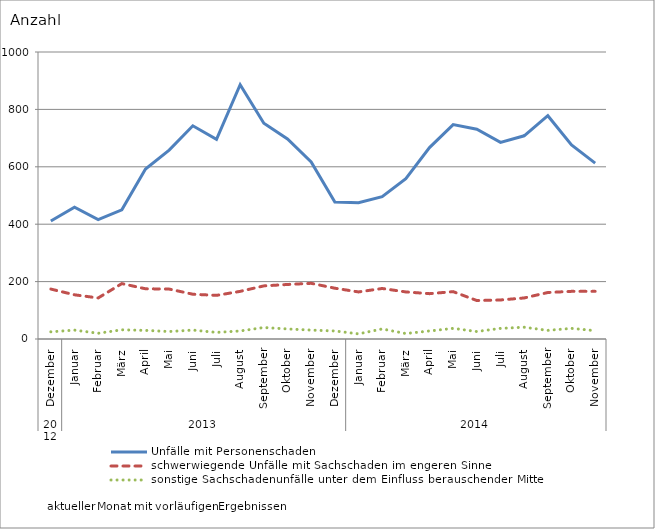
| Category | Unfälle mit Personenschaden | schwerwiegende Unfälle mit Sachschaden im engeren Sinne | sonstige Sachschadenunfälle unter dem Einfluss berauschender Mittel |
|---|---|---|---|
| 0 | 411 | 174 | 25 |
| 1 | 459 | 154 | 31 |
| 2 | 416 | 143 | 20 |
| 3 | 450 | 193 | 32 |
| 4 | 592 | 175 | 30 |
| 5 | 658 | 174 | 26 |
| 6 | 743 | 156 | 31 |
| 7 | 696 | 152 | 23 |
| 8 | 886 | 166 | 28 |
| 9 | 752 | 185 | 40 |
| 10 | 697 | 190 | 35 |
| 11 | 617 | 194 | 31 |
| 12 | 477 | 177 | 28 |
| 13 | 475 | 164 | 18 |
| 14 | 496 | 176 | 35 |
| 15 | 559 | 164 | 19 |
| 16 | 667 | 158 | 28 |
| 17 | 747 | 165 | 37 |
| 18 | 731 | 134 | 26 |
| 19 | 685 | 136 | 37 |
| 20 | 708 | 143 | 41 |
| 21 | 778 | 162 | 30 |
| 22 | 676 | 166 | 37 |
| 23 | 613 | 166 | 29 |